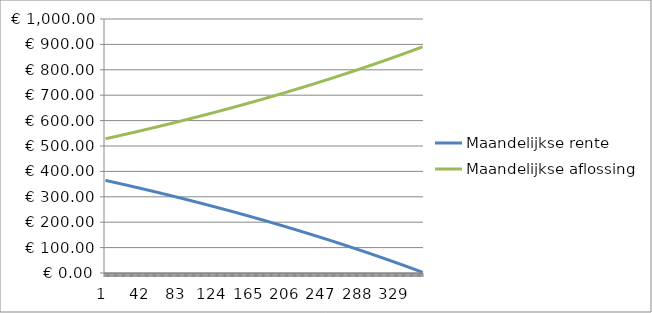
| Category | Maandelijkse rente | Maandelijkse aflossing |
|---|---|---|
| 0 | 364.583 | 528.525 |
| 1 | 363.813 | 529.296 |
| 2 | 363.041 | 530.068 |
| 3 | 362.268 | 530.841 |
| 4 | 361.494 | 531.615 |
| 5 | 360.718 | 532.39 |
| 6 | 359.942 | 533.167 |
| 7 | 359.164 | 533.944 |
| 8 | 358.386 | 534.723 |
| 9 | 357.606 | 535.503 |
| 10 | 356.825 | 536.284 |
| 11 | 356.043 | 537.066 |
| 12 | 355.26 | 537.849 |
| 13 | 354.475 | 538.633 |
| 14 | 353.69 | 539.419 |
| 15 | 352.903 | 540.206 |
| 16 | 352.115 | 540.993 |
| 17 | 351.326 | 541.782 |
| 18 | 350.536 | 542.572 |
| 19 | 349.745 | 543.364 |
| 20 | 348.953 | 544.156 |
| 21 | 348.159 | 544.95 |
| 22 | 347.364 | 545.744 |
| 23 | 346.568 | 546.54 |
| 24 | 345.771 | 547.337 |
| 25 | 344.973 | 548.135 |
| 26 | 344.174 | 548.935 |
| 27 | 343.373 | 549.735 |
| 28 | 342.572 | 550.537 |
| 29 | 341.769 | 551.34 |
| 30 | 340.965 | 552.144 |
| 31 | 340.159 | 552.949 |
| 32 | 339.353 | 553.756 |
| 33 | 338.546 | 554.563 |
| 34 | 337.737 | 555.372 |
| 35 | 336.927 | 556.182 |
| 36 | 336.116 | 556.993 |
| 37 | 335.303 | 557.805 |
| 38 | 334.49 | 558.619 |
| 39 | 333.675 | 559.433 |
| 40 | 332.86 | 560.249 |
| 41 | 332.042 | 561.066 |
| 42 | 331.224 | 561.884 |
| 43 | 330.405 | 562.704 |
| 44 | 329.584 | 563.524 |
| 45 | 328.762 | 564.346 |
| 46 | 327.939 | 565.169 |
| 47 | 327.115 | 565.993 |
| 48 | 326.29 | 566.819 |
| 49 | 325.463 | 567.645 |
| 50 | 324.635 | 568.473 |
| 51 | 323.806 | 569.302 |
| 52 | 322.976 | 570.132 |
| 53 | 322.145 | 570.964 |
| 54 | 321.312 | 571.797 |
| 55 | 320.478 | 572.63 |
| 56 | 319.643 | 573.466 |
| 57 | 318.807 | 574.302 |
| 58 | 317.969 | 575.139 |
| 59 | 317.131 | 575.978 |
| 60 | 316.291 | 576.818 |
| 61 | 315.449 | 577.659 |
| 62 | 314.607 | 578.502 |
| 63 | 313.763 | 579.345 |
| 64 | 312.918 | 580.19 |
| 65 | 312.072 | 581.036 |
| 66 | 311.225 | 581.884 |
| 67 | 310.376 | 582.732 |
| 68 | 309.527 | 583.582 |
| 69 | 308.676 | 584.433 |
| 70 | 307.823 | 585.285 |
| 71 | 306.97 | 586.139 |
| 72 | 306.115 | 586.994 |
| 73 | 305.259 | 587.85 |
| 74 | 304.402 | 588.707 |
| 75 | 303.543 | 589.566 |
| 76 | 302.683 | 590.425 |
| 77 | 301.822 | 591.286 |
| 78 | 300.96 | 592.149 |
| 79 | 300.096 | 593.012 |
| 80 | 299.232 | 593.877 |
| 81 | 298.365 | 594.743 |
| 82 | 297.498 | 595.61 |
| 83 | 296.63 | 596.479 |
| 84 | 295.76 | 597.349 |
| 85 | 294.889 | 598.22 |
| 86 | 294.016 | 599.092 |
| 87 | 293.142 | 599.966 |
| 88 | 292.268 | 600.841 |
| 89 | 291.391 | 601.717 |
| 90 | 290.514 | 602.595 |
| 91 | 289.635 | 603.474 |
| 92 | 288.755 | 604.354 |
| 93 | 287.874 | 605.235 |
| 94 | 286.991 | 606.118 |
| 95 | 286.107 | 607.002 |
| 96 | 285.222 | 607.887 |
| 97 | 284.335 | 608.773 |
| 98 | 283.448 | 609.661 |
| 99 | 282.558 | 610.55 |
| 100 | 281.668 | 611.441 |
| 101 | 280.776 | 612.332 |
| 102 | 279.883 | 613.225 |
| 103 | 278.989 | 614.12 |
| 104 | 278.094 | 615.015 |
| 105 | 277.197 | 615.912 |
| 106 | 276.298 | 616.81 |
| 107 | 275.399 | 617.71 |
| 108 | 274.498 | 618.611 |
| 109 | 273.596 | 619.513 |
| 110 | 272.692 | 620.416 |
| 111 | 271.788 | 621.321 |
| 112 | 270.882 | 622.227 |
| 113 | 269.974 | 623.134 |
| 114 | 269.065 | 624.043 |
| 115 | 268.155 | 624.953 |
| 116 | 267.244 | 625.865 |
| 117 | 266.331 | 626.777 |
| 118 | 265.417 | 627.691 |
| 119 | 264.502 | 628.607 |
| 120 | 263.585 | 629.523 |
| 121 | 262.667 | 630.442 |
| 122 | 261.748 | 631.361 |
| 123 | 260.827 | 632.282 |
| 124 | 259.905 | 633.204 |
| 125 | 258.981 | 634.127 |
| 126 | 258.057 | 635.052 |
| 127 | 257.131 | 635.978 |
| 128 | 256.203 | 636.906 |
| 129 | 255.274 | 637.834 |
| 130 | 254.344 | 638.765 |
| 131 | 253.413 | 639.696 |
| 132 | 252.48 | 640.629 |
| 133 | 251.545 | 641.563 |
| 134 | 250.61 | 642.499 |
| 135 | 249.673 | 643.436 |
| 136 | 248.734 | 644.374 |
| 137 | 247.795 | 645.314 |
| 138 | 246.854 | 646.255 |
| 139 | 245.911 | 647.197 |
| 140 | 244.967 | 648.141 |
| 141 | 244.022 | 649.086 |
| 142 | 243.076 | 650.033 |
| 143 | 242.128 | 650.981 |
| 144 | 241.178 | 651.93 |
| 145 | 240.228 | 652.881 |
| 146 | 239.275 | 653.833 |
| 147 | 238.322 | 654.787 |
| 148 | 237.367 | 655.742 |
| 149 | 236.411 | 656.698 |
| 150 | 235.453 | 657.656 |
| 151 | 234.494 | 658.615 |
| 152 | 233.534 | 659.575 |
| 153 | 232.572 | 660.537 |
| 154 | 231.608 | 661.5 |
| 155 | 230.644 | 662.465 |
| 156 | 229.678 | 663.431 |
| 157 | 228.71 | 664.399 |
| 158 | 227.741 | 665.367 |
| 159 | 226.771 | 666.338 |
| 160 | 225.799 | 667.31 |
| 161 | 224.826 | 668.283 |
| 162 | 223.851 | 669.257 |
| 163 | 222.875 | 670.233 |
| 164 | 221.898 | 671.211 |
| 165 | 220.919 | 672.19 |
| 166 | 219.939 | 673.17 |
| 167 | 218.957 | 674.152 |
| 168 | 217.974 | 675.135 |
| 169 | 216.989 | 676.119 |
| 170 | 216.003 | 677.105 |
| 171 | 215.016 | 678.093 |
| 172 | 214.027 | 679.082 |
| 173 | 213.037 | 680.072 |
| 174 | 212.045 | 681.064 |
| 175 | 211.052 | 682.057 |
| 176 | 210.057 | 683.052 |
| 177 | 209.061 | 684.048 |
| 178 | 208.063 | 685.045 |
| 179 | 207.064 | 686.044 |
| 180 | 206.064 | 687.045 |
| 181 | 205.062 | 688.047 |
| 182 | 204.059 | 689.05 |
| 183 | 203.054 | 690.055 |
| 184 | 202.047 | 691.061 |
| 185 | 201.04 | 692.069 |
| 186 | 200.03 | 693.078 |
| 187 | 199.02 | 694.089 |
| 188 | 198.007 | 695.101 |
| 189 | 196.994 | 696.115 |
| 190 | 195.978 | 697.13 |
| 191 | 194.962 | 698.147 |
| 192 | 193.944 | 699.165 |
| 193 | 192.924 | 700.185 |
| 194 | 191.903 | 701.206 |
| 195 | 190.88 | 702.228 |
| 196 | 189.856 | 703.252 |
| 197 | 188.831 | 704.278 |
| 198 | 187.804 | 705.305 |
| 199 | 186.775 | 706.334 |
| 200 | 185.745 | 707.364 |
| 201 | 184.713 | 708.395 |
| 202 | 183.68 | 709.428 |
| 203 | 182.646 | 710.463 |
| 204 | 181.61 | 711.499 |
| 205 | 180.572 | 712.537 |
| 206 | 179.533 | 713.576 |
| 207 | 178.492 | 714.616 |
| 208 | 177.45 | 715.658 |
| 209 | 176.407 | 716.702 |
| 210 | 175.361 | 717.747 |
| 211 | 174.315 | 718.794 |
| 212 | 173.266 | 719.842 |
| 213 | 172.217 | 720.892 |
| 214 | 171.165 | 721.943 |
| 215 | 170.112 | 722.996 |
| 216 | 169.058 | 724.051 |
| 217 | 168.002 | 725.106 |
| 218 | 166.945 | 726.164 |
| 219 | 165.886 | 727.223 |
| 220 | 164.825 | 728.283 |
| 221 | 163.763 | 729.345 |
| 222 | 162.7 | 730.409 |
| 223 | 161.634 | 731.474 |
| 224 | 160.568 | 732.541 |
| 225 | 159.499 | 733.609 |
| 226 | 158.429 | 734.679 |
| 227 | 157.358 | 735.751 |
| 228 | 156.285 | 736.824 |
| 229 | 155.211 | 737.898 |
| 230 | 154.134 | 738.974 |
| 231 | 153.057 | 740.052 |
| 232 | 151.978 | 741.131 |
| 233 | 150.897 | 742.212 |
| 234 | 149.814 | 743.294 |
| 235 | 148.73 | 744.378 |
| 236 | 147.645 | 745.464 |
| 237 | 146.558 | 746.551 |
| 238 | 145.469 | 747.64 |
| 239 | 144.379 | 748.73 |
| 240 | 143.287 | 749.822 |
| 241 | 142.193 | 750.915 |
| 242 | 141.098 | 752.01 |
| 243 | 140.001 | 753.107 |
| 244 | 138.903 | 754.205 |
| 245 | 137.803 | 755.305 |
| 246 | 136.702 | 756.407 |
| 247 | 135.599 | 757.51 |
| 248 | 134.494 | 758.615 |
| 249 | 133.388 | 759.721 |
| 250 | 132.28 | 760.829 |
| 251 | 131.17 | 761.938 |
| 252 | 130.059 | 763.05 |
| 253 | 128.946 | 764.162 |
| 254 | 127.832 | 765.277 |
| 255 | 126.716 | 766.393 |
| 256 | 125.598 | 767.51 |
| 257 | 124.479 | 768.63 |
| 258 | 123.358 | 769.751 |
| 259 | 122.235 | 770.873 |
| 260 | 121.111 | 771.997 |
| 261 | 119.985 | 773.123 |
| 262 | 118.858 | 774.251 |
| 263 | 117.729 | 775.38 |
| 264 | 116.598 | 776.511 |
| 265 | 115.466 | 777.643 |
| 266 | 114.332 | 778.777 |
| 267 | 113.196 | 779.913 |
| 268 | 112.059 | 781.05 |
| 269 | 110.92 | 782.189 |
| 270 | 109.779 | 783.33 |
| 271 | 108.636 | 784.472 |
| 272 | 107.492 | 785.616 |
| 273 | 106.347 | 786.762 |
| 274 | 105.199 | 787.909 |
| 275 | 104.05 | 789.058 |
| 276 | 102.9 | 790.209 |
| 277 | 101.747 | 791.361 |
| 278 | 100.593 | 792.515 |
| 279 | 99.437 | 793.671 |
| 280 | 98.28 | 794.829 |
| 281 | 97.121 | 795.988 |
| 282 | 95.96 | 797.149 |
| 283 | 94.798 | 798.311 |
| 284 | 93.633 | 799.475 |
| 285 | 92.467 | 800.641 |
| 286 | 91.3 | 801.809 |
| 287 | 90.131 | 802.978 |
| 288 | 88.96 | 804.149 |
| 289 | 87.787 | 805.322 |
| 290 | 86.612 | 806.496 |
| 291 | 85.436 | 807.672 |
| 292 | 84.258 | 808.85 |
| 293 | 83.079 | 810.03 |
| 294 | 81.898 | 811.211 |
| 295 | 80.714 | 812.394 |
| 296 | 79.53 | 813.579 |
| 297 | 78.343 | 814.765 |
| 298 | 77.155 | 815.954 |
| 299 | 75.965 | 817.143 |
| 300 | 74.773 | 818.335 |
| 301 | 73.58 | 819.529 |
| 302 | 72.385 | 820.724 |
| 303 | 71.188 | 821.921 |
| 304 | 69.989 | 823.119 |
| 305 | 68.789 | 824.32 |
| 306 | 67.587 | 825.522 |
| 307 | 66.383 | 826.726 |
| 308 | 65.177 | 827.931 |
| 309 | 63.97 | 829.139 |
| 310 | 62.761 | 830.348 |
| 311 | 61.55 | 831.559 |
| 312 | 60.337 | 832.771 |
| 313 | 59.123 | 833.986 |
| 314 | 57.907 | 835.202 |
| 315 | 56.689 | 836.42 |
| 316 | 55.469 | 837.64 |
| 317 | 54.247 | 838.861 |
| 318 | 53.024 | 840.085 |
| 319 | 51.799 | 841.31 |
| 320 | 50.572 | 842.537 |
| 321 | 49.343 | 843.766 |
| 322 | 48.113 | 844.996 |
| 323 | 46.88 | 846.228 |
| 324 | 45.646 | 847.462 |
| 325 | 44.41 | 848.698 |
| 326 | 43.173 | 849.936 |
| 327 | 41.933 | 851.175 |
| 328 | 40.692 | 852.417 |
| 329 | 39.449 | 853.66 |
| 330 | 38.204 | 854.905 |
| 331 | 36.957 | 856.152 |
| 332 | 35.709 | 857.4 |
| 333 | 34.458 | 858.65 |
| 334 | 33.206 | 859.903 |
| 335 | 31.952 | 861.157 |
| 336 | 30.696 | 862.413 |
| 337 | 29.438 | 863.67 |
| 338 | 28.179 | 864.93 |
| 339 | 26.918 | 866.191 |
| 340 | 25.654 | 867.454 |
| 341 | 24.389 | 868.719 |
| 342 | 23.122 | 869.986 |
| 343 | 21.854 | 871.255 |
| 344 | 20.583 | 872.525 |
| 345 | 19.311 | 873.798 |
| 346 | 18.036 | 875.072 |
| 347 | 16.76 | 876.348 |
| 348 | 15.482 | 877.626 |
| 349 | 14.202 | 878.906 |
| 350 | 12.921 | 880.188 |
| 351 | 11.637 | 881.472 |
| 352 | 10.352 | 882.757 |
| 353 | 9.064 | 884.044 |
| 354 | 7.775 | 885.334 |
| 355 | 6.484 | 886.625 |
| 356 | 5.191 | 887.918 |
| 357 | 3.896 | 889.213 |
| 358 | 2.599 | 890.509 |
| 359 | 1.301 | 891.808 |